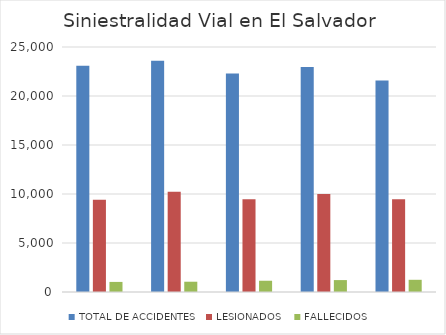
| Category | TOTAL DE ACCIDENTES | LESIONADOS  | FALLECIDOS  |
|---|---|---|---|
|  | 23098 | 9426 | 1029 |
|  | 23599 | 10236 | 1049 |
|  | 22299 | 9466 | 1149 |
|  | 22958 | 9996 | 1216 |
|  | 21582 | 9462 | 1245 |